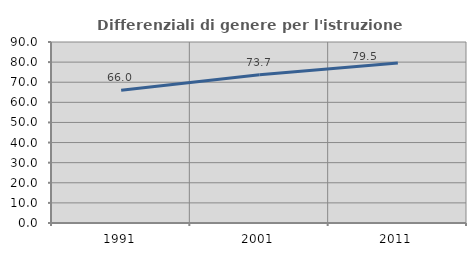
| Category | Differenziali di genere per l'istruzione superiore |
|---|---|
| 1991.0 | 65.964 |
| 2001.0 | 73.731 |
| 2011.0 | 79.549 |